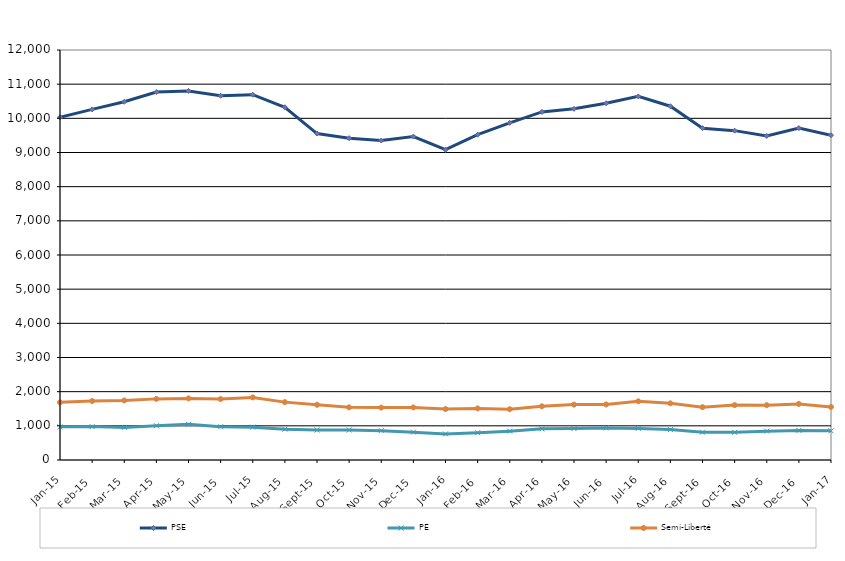
| Category | PSE | PE | Semi-Liberté |
|---|---|---|---|
| 2015-01-01 | 10030 | 970 | 1689 |
| 2015-02-01 | 10261 | 977 | 1726 |
| 2015-03-01 | 10485 | 954 | 1742 |
| 2015-04-01 | 10770 | 1003 | 1789 |
| 2015-05-01 | 10801 | 1043 | 1803 |
| 2015-06-01 | 10662 | 973 | 1785 |
| 2015-07-01 | 10692 | 961 | 1832 |
| 2015-08-01 | 10325 | 903 | 1694 |
| 2015-09-01 | 9555 | 878 | 1616 |
| 2015-10-01 | 9420 | 877 | 1542 |
| 2015-11-01 | 9350 | 859 | 1533 |
| 2015-12-01 | 9466 | 815 | 1539 |
| 2016-01-01 | 9081 | 764 | 1490 |
| 2016-02-01 | 9521 | 798 | 1510 |
| 2016-03-01 | 9868 | 845 | 1486 |
| 2016-04-01 | 10187 | 912 | 1572 |
| 2016-05-01 | 10278 | 920 | 1621 |
| 2016-06-01 | 10441 | 939 | 1625 |
| 2016-07-01 | 10642 | 923 | 1718 |
| 2016-08-01 | 10355 | 890 | 1658 |
| 2016-09-01 | 9712 | 813 | 1546 |
| 2016-10-01 | 9640 | 809 | 1607 |
| 2016-11-01 | 9484 | 844 | 1605 |
| 2016-12-01 | 9714 | 866 | 1641 |
| 2017-01-01 | 9505 | 855 | 1553 |